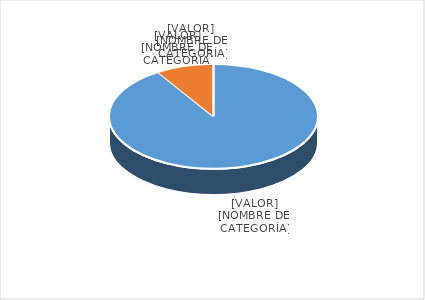
| Category | Series 0 |
|---|---|
| PRESUPUESTO VIGENTE PARA 2023 | 28345594 |
| PRESUPUESTO EJECUTADO  | 2786696.84 |
| PORCENTAJE DE EJECUCIÓN  | 0.098 |